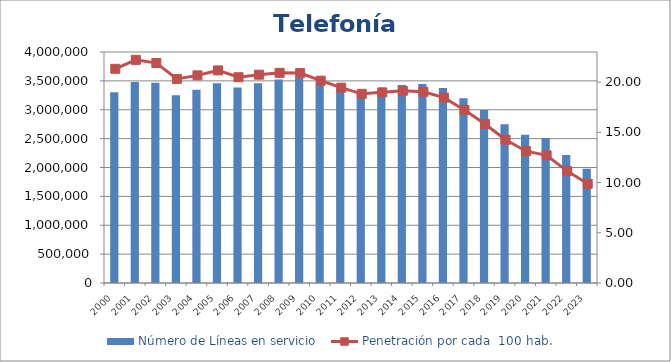
| Category | Número de Líneas en servicio |
|---|---|
| 2000.0 | 3302498 |
| 2001.0 | 3478492 |
| 2002.0 | 3467013 |
| 2003.0 | 3252063 |
| 2004.0 | 3345102 |
| 2005.0 | 3460645 |
| 2006.0 | 3383597 |
| 2007.0 | 3459611 |
| 2008.0 | 3524790 |
| 2009.0 | 3555311 |
| 2010.0 | 3459367 |
| 2011.0 | 3370104 |
| 2012.0 | 3292502 |
| 2013.0 | 3347231 |
| 2014.0 | 3427749 |
| 2015.0 | 3445880 |
| 2016.0 | 3375037 |
| 2017.0 | 3200245 |
| 2018.0 | 2997192 |
| 2019.0 | 2750272 |
| 2020.0 | 2567938 |
| 2021.0 | 2510972 |
| 2022.0 | 2216786 |
| 2023.0 | 1977657 |